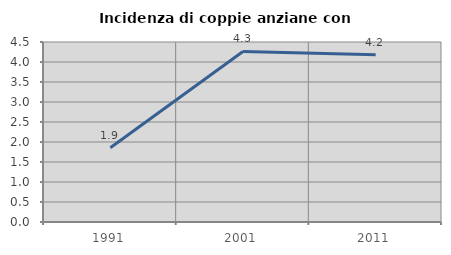
| Category | Incidenza di coppie anziane con figli |
|---|---|
| 1991.0 | 1.855 |
| 2001.0 | 4.263 |
| 2011.0 | 4.181 |